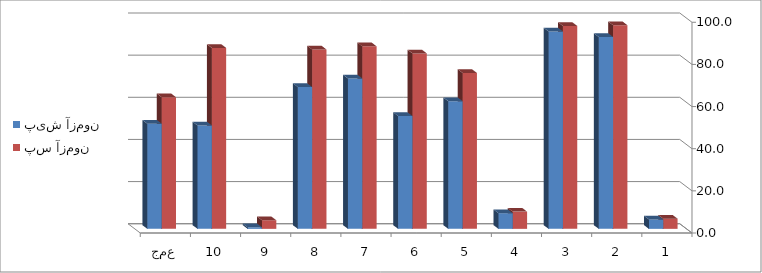
| Category | پیش آزمون | پس آزمون |
|---|---|---|
| 1 | 4.461 | 4.833 |
| 2 | 91.078 | 96.654 |
| 3 | 93.68 | 96.283 |
| 4 | 7.435 | 8.178 |
| 5 | 60.595 | 73.978 |
| 6 | 53.532 | 83.271 |
| 7 | 71.375 | 86.617 |
| 8 | 67.286 | 85.13 |
| 9 | 0.743 | 4.089 |
| 10 | 49.071 | 85.874 |
| جمع | 49.926 | 62.491 |